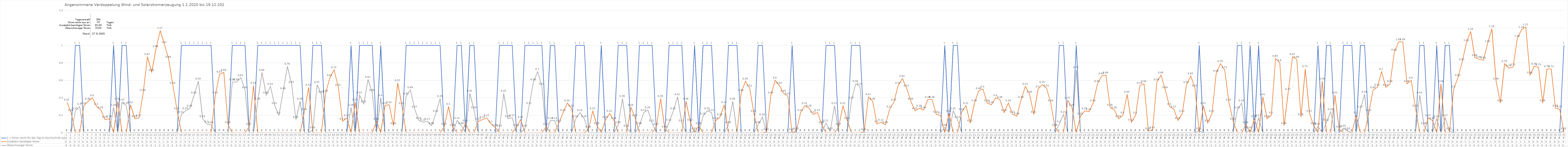
| Category | 1 = Strom reicht für den Tag im Durchschnitt aus | Zusätzlich benötigter Strom | Überschüssiger Strom |
|---|---|---|---|
| 0 | 0 | 0.35 | 0 |
| 1 | 0 | 0.23 | 0 |
| 2 | 1 | 0 | 0.25 |
| 3 | 1 | 0 | 0.3 |
| 4 | 0 | 0.31 | 0 |
| 5 | 0 | 0.36 | 0 |
| 6 | 0 | 0.4 | 0 |
| 7 | 0 | 0.3 | 0 |
| 8 | 0 | 0.26 | 0 |
| 9 | 0 | 0.15 | 0 |
| 10 | 0 | 0.16 | 0 |
| 11 | 1 | 0 | 0.29 |
| 12 | 0 | 0.36 | 0 |
| 13 | 1 | 0 | 0.35 |
| 14 | 1 | 0 | 0.31 |
| 15 | 0 | 0.32 | 0 |
| 16 | 0 | 0.16 | 0 |
| 17 | 0 | 0.17 | 0 |
| 18 | 0 | 0.46 | 0 |
| 19 | 0 | 0.87 | 0 |
| 20 | 0 | 0.69 | 0 |
| 21 | 0 | 0.96 | 0 |
| 22 | 0 | 1.17 | 0 |
| 23 | 0 | 1.01 | 0 |
| 24 | 0 | 0.84 | 0 |
| 25 | 0 | 0.54 | 0 |
| 26 | 0 | 0.25 | 0 |
| 27 | 1 | 0 | 0.21 |
| 28 | 1 | 0 | 0.25 |
| 29 | 1 | 0 | 0.28 |
| 30 | 1 | 0 | 0.43 |
| 31 | 1 | 0 | 0.59 |
| 32 | 1 | 0 | 0.16 |
| 33 | 1 | 0 | 0.1 |
| 34 | 1 | 0 | 0.09 |
| 35 | 0 | 0.43 | 0 |
| 36 | 0 | 0.67 | 0 |
| 37 | 0 | 0.69 | 0 |
| 38 | 0 | 0.09 | 0 |
| 39 | 1 | 0 | 0.58 |
| 40 | 1 | 0 | 0.58 |
| 41 | 1 | 0 | 0.63 |
| 42 | 1 | 0 | 0.49 |
| 43 | 0 | 0.07 | 0 |
| 44 | 0 | 0.54 | 0 |
| 45 | 1 | 0 | 0.36 |
| 46 | 1 | 0 | 0.69 |
| 47 | 1 | 0 | 0.43 |
| 48 | 1 | 0 | 0.53 |
| 49 | 1 | 0 | 0.31 |
| 50 | 1 | 0 | 0.2 |
| 51 | 1 | 0 | 0.48 |
| 52 | 1 | 0 | 0.76 |
| 53 | 1 | 0 | 0.55 |
| 54 | 1 | 0 | 0.15 |
| 55 | 1 | 0 | 0.36 |
| 56 | 0 | 0.24 | 0 |
| 57 | 0 | 0.52 | 0 |
| 58 | 1 | 0 | 0.03 |
| 59 | 1 | 0 | 0.55 |
| 60 | 1 | 0 | 0.44 |
| 61 | 0 | 0.45 | 0 |
| 62 | 0 | 0.63 | 0 |
| 63 | 0 | 0.72 | 0 |
| 64 | 0 | 0.52 | 0 |
| 65 | 0 | 0.13 | 0 |
| 66 | 0 | 0.17 | 0 |
| 67 | 1 | 0 | 0.29 |
| 68 | 0 | 0.35 | 0 |
| 69 | 1 | 0 | 0.43 |
| 70 | 1 | 0 | 0.33 |
| 71 | 1 | 0 | 0.61 |
| 72 | 1 | 0 | 0.46 |
| 73 | 0 | 0.13 | 0 |
| 74 | 1 | 0 | 0.4 |
| 75 | 0 | 0.31 | 0 |
| 76 | 0 | 0.32 | 0 |
| 77 | 0 | 0.08 | 0 |
| 78 | 0 | 0.57 | 0 |
| 79 | 0 | 0.31 | 0 |
| 80 | 1 | 0 | 0.42 |
| 81 | 1 | 0 | 0.49 |
| 82 | 1 | 0 | 0.27 |
| 83 | 1 | 0 | 0.14 |
| 84 | 1 | 0 | 0.12 |
| 85 | 1 | 0 | 0.13 |
| 86 | 1 | 0 | 0.08 |
| 87 | 1 | 0 | 0.22 |
| 88 | 1 | 0 | 0.39 |
| 89 | 0 | 0.07 | 0 |
| 90 | 0 | 0.3 | 0 |
| 91 | 0 | 0.06 | 0 |
| 92 | 1 | 0 | 0.14 |
| 93 | 1 | 0 | 0.08 |
| 94 | 0 | 0.11 | 0 |
| 95 | 1 | 0 | 0.45 |
| 96 | 1 | 0 | 0.26 |
| 97 | 0 | 0.13 | 0 |
| 98 | 0 | 0.15 | 0 |
| 99 | 0 | 0.17 | 0 |
| 100 | 0 | 0.1 | 0 |
| 101 | 0 | 0.06 | 0 |
| 102 | 1 | 0 | 0.05 |
| 103 | 1 | 0 | 0.45 |
| 104 | 1 | 0 | 0.16 |
| 105 | 1 | 0 | 0.17 |
| 106 | 0 | 0.06 | 0 |
| 107 | 0 | 0.15 | 0 |
| 108 | 1 | 0 | 0.05 |
| 109 | 1 | 0 | 0.31 |
| 110 | 1 | 0 | 0.58 |
| 111 | 1 | 0 | 0.7 |
| 112 | 1 | 0 | 0.53 |
| 113 | 0 | 0.07 | 0 |
| 114 | 1 | 0 | 0.14 |
| 115 | 1 | 0 | 0.14 |
| 116 | 0 | 0.11 | 0 |
| 117 | 0 | 0.23 | 0 |
| 118 | 0 | 0.34 | 0 |
| 119 | 0 | 0.28 | 0 |
| 120 | 1 | 0 | 0.16 |
| 121 | 1 | 0 | 0.23 |
| 122 | 1 | 0 | 0.16 |
| 123 | 0 | 0.04 | 0 |
| 124 | 0 | 0.25 | 0 |
| 125 | 0 | 0.08 | 0 |
| 126 | 1 | 0 | 0 |
| 127 | 0 | 0.15 | 0 |
| 128 | 0 | 0.22 | 0 |
| 129 | 0 | 0.14 | 0 |
| 130 | 1 | 0 | 0.09 |
| 131 | 1 | 0 | 0.39 |
| 132 | 1 | 0 | 0.05 |
| 133 | 0 | 0.29 | 0 |
| 134 | 0 | 0.17 | 0 |
| 135 | 1 | 0 | 0.08 |
| 136 | 1 | 0 | 0.23 |
| 137 | 1 | 0 | 0.26 |
| 138 | 1 | 0 | 0.11 |
| 139 | 0 | 0.07 | 0 |
| 140 | 0 | 0.39 | 0 |
| 141 | 0 | 0.04 | 0 |
| 142 | 1 | 0 | 0.12 |
| 143 | 1 | 0 | 0.25 |
| 144 | 1 | 0 | 0.41 |
| 145 | 1 | 0 | 0.11 |
| 146 | 0 | 0.36 | 0 |
| 147 | 0 | 0.12 | 0 |
| 148 | 1 | 0 | 0.02 |
| 149 | 0 | 0.08 | 0 |
| 150 | 1 | 0 | 0.19 |
| 151 | 1 | 0 | 0.25 |
| 152 | 1 | 0 | 0.23 |
| 153 | 0 | 0.14 | 0 |
| 154 | 0 | 0.18 | 0 |
| 155 | 0 | 0.32 | 0 |
| 156 | 1 | 0 | 0.09 |
| 157 | 1 | 0 | 0.36 |
| 158 | 1 | 0 | 0 |
| 159 | 0 | 0.46 | 0 |
| 160 | 0 | 0.59 | 0 |
| 161 | 0 | 0.51 | 0 |
| 162 | 0 | 0.22 | 0 |
| 163 | 1 | 0 | 0.09 |
| 164 | 1 | 0 | 0.18 |
| 165 | 0 | 0.01 | 0 |
| 166 | 0 | 0.43 | 0 |
| 167 | 0 | 0.6 | 0 |
| 168 | 0 | 0.54 | 0 |
| 169 | 0 | 0.45 | 0 |
| 170 | 0 | 0.42 | 0 |
| 171 | 1 | 0 | 0.01 |
| 172 | 0 | 0.02 | 0 |
| 173 | 0 | 0.23 | 0 |
| 174 | 0 | 0.31 | 0 |
| 175 | 0 | 0.28 | 0 |
| 176 | 0 | 0.21 | 0 |
| 177 | 0 | 0.23 | 0 |
| 178 | 0 | 0.09 | 0 |
| 179 | 1 | 0 | 0.11 |
| 180 | 1 | 0 | 0.02 |
| 181 | 1 | 0 | 0.31 |
| 182 | 0 | 0.07 | 0 |
| 183 | 0 | 0.31 | 0 |
| 184 | 0 | 0.14 | 0 |
| 185 | 1 | 0 | 0.37 |
| 186 | 1 | 0 | 0.56 |
| 187 | 1 | 0 | 0.53 |
| 188 | 0 | 0.01 | 0 |
| 189 | 0 | 0.41 | 0 |
| 190 | 0 | 0.36 | 0 |
| 191 | 0 | 0.1 | 0 |
| 192 | 0 | 0.12 | 0 |
| 193 | 0 | 0.09 | 0 |
| 194 | 0 | 0.27 | 0 |
| 195 | 0 | 0.35 | 0 |
| 196 | 0 | 0.54 | 0 |
| 197 | 0 | 0.62 | 0 |
| 198 | 0 | 0.51 | 0 |
| 199 | 0 | 0.36 | 0 |
| 200 | 0 | 0.25 | 0 |
| 201 | 0 | 0.28 | 0 |
| 202 | 0 | 0.26 | 0 |
| 203 | 0 | 0.38 | 0 |
| 204 | 0 | 0.38 | 0 |
| 205 | 0 | 0.21 | 0 |
| 206 | 0 | 0.2 | 0 |
| 207 | 1 | 0 | 0.06 |
| 208 | 0 | 0.22 | 0 |
| 209 | 1 | 0 | 0.25 |
| 210 | 1 | 0 | 0.15 |
| 211 | 0 | 0.24 | 0 |
| 212 | 0 | 0.31 | 0 |
| 213 | 0 | 0.11 | 0 |
| 214 | 0 | 0.34 | 0 |
| 215 | 0 | 0.48 | 0 |
| 216 | 0 | 0.5 | 0 |
| 217 | 0 | 0.34 | 0 |
| 218 | 0 | 0.32 | 0 |
| 219 | 0 | 0.4 | 0 |
| 220 | 0 | 0.38 | 0 |
| 221 | 0 | 0.23 | 0 |
| 222 | 0 | 0.34 | 0 |
| 223 | 0 | 0.21 | 0 |
| 224 | 0 | 0.19 | 0 |
| 225 | 0 | 0.38 | 0 |
| 226 | 0 | 0.53 | 0 |
| 227 | 0 | 0.44 | 0 |
| 228 | 0 | 0.21 | 0 |
| 229 | 0 | 0.5 | 0 |
| 230 | 0 | 0.55 | 0 |
| 231 | 0 | 0.51 | 0 |
| 232 | 0 | 0.34 | 0 |
| 233 | 0 | 0.06 | 0 |
| 234 | 1 | 0 | 0.1 |
| 235 | 1 | 0 | 0.21 |
| 236 | 0 | 0.37 | 0 |
| 237 | 0 | 0.29 | 0 |
| 238 | 1 | 0 | 0.72 |
| 239 | 0 | 0.19 | 0 |
| 240 | 0 | 0.25 | 0 |
| 241 | 0 | 0.24 | 0 |
| 242 | 0 | 0.34 | 0 |
| 243 | 0 | 0.56 | 0 |
| 244 | 0 | 0.65 | 0 |
| 245 | 0 | 0.66 | 0 |
| 246 | 0 | 0.29 | 0 |
| 247 | 0 | 0.26 | 0 |
| 248 | 0 | 0.16 | 0 |
| 249 | 0 | 0.2 | 0 |
| 250 | 0 | 0.44 | 0 |
| 251 | 0 | 0.12 | 0 |
| 252 | 0 | 0.2 | 0 |
| 253 | 0 | 0.54 | 0 |
| 254 | 0 | 0.56 | 0 |
| 255 | 0 | 0.02 | 0 |
| 256 | 0 | 0.03 | 0 |
| 257 | 0 | 0.58 | 0 |
| 258 | 0 | 0.66 | 0 |
| 259 | 0 | 0.49 | 0 |
| 260 | 0 | 0.3 | 0 |
| 261 | 0 | 0.27 | 0 |
| 262 | 0 | 0.14 | 0 |
| 263 | 0 | 0.22 | 0 |
| 264 | 0 | 0.55 | 0 |
| 265 | 0 | 0.65 | 0 |
| 266 | 0 | 0.51 | 0 |
| 267 | 1 | 0 | 0.02 |
| 268 | 0 | 0.31 | 0 |
| 269 | 0 | 0.11 | 0 |
| 270 | 0 | 0.22 | 0 |
| 271 | 0 | 0.68 | 0 |
| 272 | 0 | 0.79 | 0 |
| 273 | 0 | 0.72 | 0 |
| 274 | 0 | 0.35 | 0 |
| 275 | 0 | 0.13 | 0 |
| 276 | 1 | 0 | 0.26 |
| 277 | 1 | 0 | 0.34 |
| 278 | 0 | 0.09 | 0 |
| 279 | 1 | 0 | 0.03 |
| 280 | 0 | 0.16 | 0 |
| 281 | 1 | 0 | 0.17 |
| 282 | 0 | 0.41 | 0 |
| 283 | 0 | 0.16 | 0 |
| 284 | 0 | 0.2 | 0 |
| 285 | 0 | 0.85 | 0 |
| 286 | 0 | 0.8 | 0 |
| 287 | 0 | 0.08 | 0 |
| 288 | 0 | 0.47 | 0 |
| 289 | 0 | 0.87 | 0 |
| 290 | 0 | 0.84 | 0 |
| 291 | 0 | 0.18 | 0 |
| 292 | 0 | 0.73 | 0 |
| 293 | 0 | 0.22 | 0 |
| 294 | 0 | 0.08 | 0 |
| 295 | 1 | 0 | 0.07 |
| 296 | 0 | 0.59 | 0 |
| 297 | 1 | 0 | 0.12 |
| 298 | 1 | 0 | 0.24 |
| 299 | 0 | 0.43 | 0 |
| 300 | 0 | 0.04 | 0 |
| 301 | 1 | 0 | 0.05 |
| 302 | 1 | 0 | 0.02 |
| 303 | 1 | 0 | 0 |
| 304 | 0 | 0.2 | 0 |
| 305 | 1 | 0 | 0.27 |
| 306 | 1 | 0 | 0.44 |
| 307 | 0 | 0.23 | 0 |
| 308 | 0 | 0.49 | 0 |
| 309 | 0 | 0.52 | 0 |
| 310 | 0 | 0.7 | 0 |
| 311 | 0 | 0.52 | 0 |
| 312 | 0 | 0.56 | 0 |
| 313 | 0 | 0.92 | 0 |
| 314 | 0 | 1.04 | 0 |
| 315 | 0 | 1.04 | 0 |
| 316 | 0 | 0.56 | 0 |
| 317 | 0 | 0.6 | 0 |
| 318 | 0 | 0.28 | 0 |
| 319 | 1 | 0 | 0.43 |
| 320 | 1 | 0 | 0.08 |
| 321 | 0 | 0.17 | 0 |
| 322 | 0 | 0.14 | 0 |
| 323 | 1 | 0 | 0.16 |
| 324 | 0 | 0.56 | 0 |
| 325 | 1 | 0 | 0.17 |
| 326 | 1 | 0 | 0.02 |
| 327 | 0 | 0.5 | 0 |
| 328 | 0 | 0.63 | 0 |
| 329 | 0 | 0.81 | 0 |
| 330 | 0 | 1.03 | 0 |
| 331 | 0 | 1.16 | 0 |
| 332 | 0 | 0.86 | 0 |
| 333 | 0 | 0.84 | 0 |
| 334 | 0 | 0.83 | 0 |
| 335 | 0 | 1.02 | 0 |
| 336 | 0 | 1.19 | 0 |
| 337 | 0 | 0.59 | 0 |
| 338 | 0 | 0.34 | 0 |
| 339 | 0 | 0.79 | 0 |
| 340 | 0 | 0.74 | 0 |
| 341 | 0 | 0.75 | 0 |
| 342 | 0 | 1.08 | 0 |
| 343 | 0 | 1.18 | 0 |
| 344 | 0 | 1.21 | 0 |
| 345 | 0 | 0.66 | 0 |
| 346 | 0 | 0.76 | 0 |
| 347 | 0 | 0.75 | 0 |
| 348 | 0 | 0.34 | 0 |
| 349 | 0 | 0.73 | 0 |
| 350 | 0 | 0.73 | 0 |
| 351 | 0 | 0.28 | 0 |
| 352 | 0 | 0.27 | 0 |
| 353 | 1 | 0 | 0.02 |